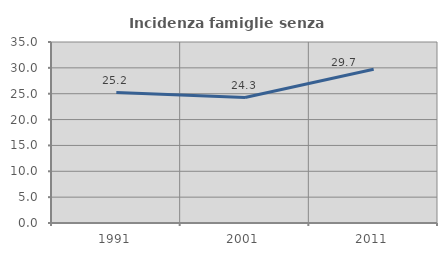
| Category | Incidenza famiglie senza nuclei |
|---|---|
| 1991.0 | 25.212 |
| 2001.0 | 24.267 |
| 2011.0 | 29.722 |